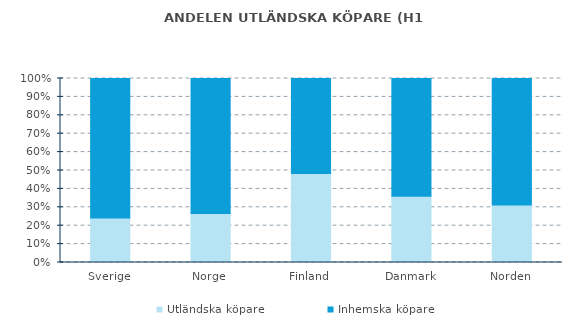
| Category | Utländska köpare | Inhemska köpare |
|---|---|---|
| Sverige | 0.242 | 0.758 |
| Norge | 0.266 | 0.734 |
| Finland | 0.483 | 0.517 |
| Danmark | 0.36 | 0.64 |
| Norden | 0.313 | 0.687 |